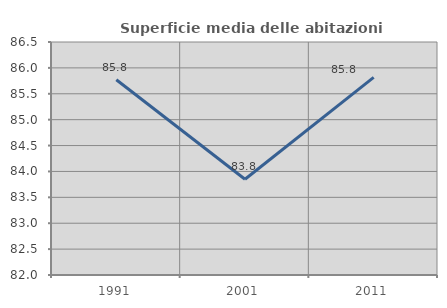
| Category | Superficie media delle abitazioni occupate |
|---|---|
| 1991.0 | 85.77 |
| 2001.0 | 83.849 |
| 2011.0 | 85.816 |